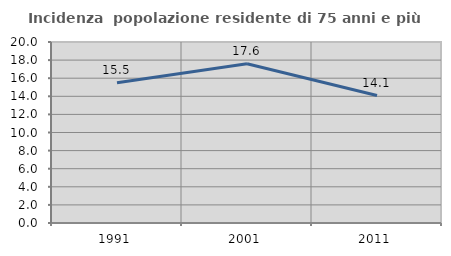
| Category | Incidenza  popolazione residente di 75 anni e più |
|---|---|
| 1991.0 | 15.498 |
| 2001.0 | 17.593 |
| 2011.0 | 14.079 |